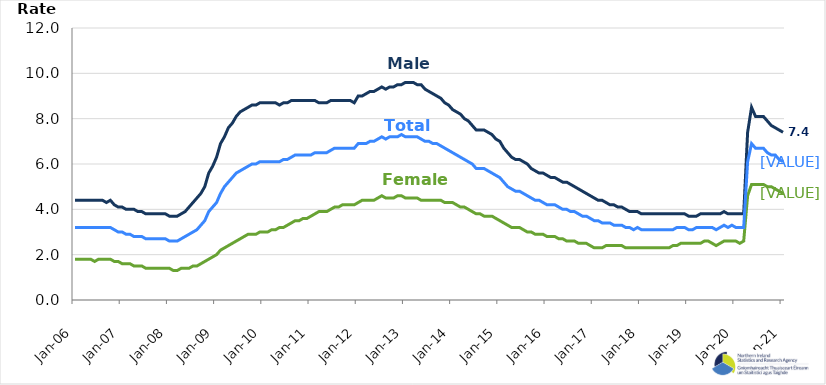
| Category | Male | Female | Total |
|---|---|---|---|
| 2006-01-01 | 4.4 | 1.8 | 3.2 |
| 2006-02-01 | 4.4 | 1.8 | 3.2 |
| 2006-03-01 | 4.4 | 1.8 | 3.2 |
| 2006-04-01 | 4.4 | 1.8 | 3.2 |
| 2006-05-01 | 4.4 | 1.8 | 3.2 |
| 2006-06-01 | 4.4 | 1.7 | 3.2 |
| 2006-07-01 | 4.4 | 1.8 | 3.2 |
| 2006-08-01 | 4.4 | 1.8 | 3.2 |
| 2006-09-01 | 4.3 | 1.8 | 3.2 |
| 2006-10-01 | 4.4 | 1.8 | 3.2 |
| 2006-11-01 | 4.2 | 1.7 | 3.1 |
| 2006-12-01 | 4.1 | 1.7 | 3 |
| 2007-01-01 | 4.1 | 1.6 | 3 |
| 2007-02-01 | 4 | 1.6 | 2.9 |
| 2007-03-01 | 4 | 1.6 | 2.9 |
| 2007-04-01 | 4 | 1.5 | 2.8 |
| 2007-05-01 | 3.9 | 1.5 | 2.8 |
| 2007-06-01 | 3.9 | 1.5 | 2.8 |
| 2007-07-01 | 3.8 | 1.4 | 2.7 |
| 2007-08-01 | 3.8 | 1.4 | 2.7 |
| 2007-09-01 | 3.8 | 1.4 | 2.7 |
| 2007-10-01 | 3.8 | 1.4 | 2.7 |
| 2007-11-01 | 3.8 | 1.4 | 2.7 |
| 2007-12-01 | 3.8 | 1.4 | 2.7 |
| 2008-01-01 | 3.7 | 1.4 | 2.6 |
| 2008-02-01 | 3.7 | 1.3 | 2.6 |
| 2008-03-01 | 3.7 | 1.3 | 2.6 |
| 2008-04-01 | 3.8 | 1.4 | 2.7 |
| 2008-05-01 | 3.9 | 1.4 | 2.8 |
| 2008-06-01 | 4.1 | 1.4 | 2.9 |
| 2008-07-01 | 4.3 | 1.5 | 3 |
| 2008-08-01 | 4.5 | 1.5 | 3.1 |
| 2008-09-01 | 4.7 | 1.6 | 3.3 |
| 2008-10-01 | 5 | 1.7 | 3.5 |
| 2008-11-01 | 5.6 | 1.8 | 3.9 |
| 2008-12-01 | 5.9 | 1.9 | 4.1 |
| 2009-01-01 | 6.3 | 2 | 4.3 |
| 2009-02-01 | 6.9 | 2.2 | 4.7 |
| 2009-03-01 | 7.2 | 2.3 | 5 |
| 2009-04-01 | 7.6 | 2.4 | 5.2 |
| 2009-05-01 | 7.8 | 2.5 | 5.4 |
| 2009-06-01 | 8.1 | 2.6 | 5.6 |
| 2009-07-01 | 8.3 | 2.7 | 5.7 |
| 2009-08-01 | 8.4 | 2.8 | 5.8 |
| 2009-09-01 | 8.5 | 2.9 | 5.9 |
| 2009-10-01 | 8.6 | 2.9 | 6 |
| 2009-11-01 | 8.6 | 2.9 | 6 |
| 2009-12-01 | 8.7 | 3 | 6.1 |
| 2010-01-01 | 8.7 | 3 | 6.1 |
| 2010-02-01 | 8.7 | 3 | 6.1 |
| 2010-03-01 | 8.7 | 3.1 | 6.1 |
| 2010-04-01 | 8.7 | 3.1 | 6.1 |
| 2010-05-01 | 8.6 | 3.2 | 6.1 |
| 2010-06-01 | 8.7 | 3.2 | 6.2 |
| 2010-07-01 | 8.7 | 3.3 | 6.2 |
| 2010-08-01 | 8.8 | 3.4 | 6.3 |
| 2010-09-01 | 8.8 | 3.5 | 6.4 |
| 2010-10-01 | 8.8 | 3.5 | 6.4 |
| 2010-11-01 | 8.8 | 3.6 | 6.4 |
| 2010-12-01 | 8.8 | 3.6 | 6.4 |
| 2011-01-01 | 8.8 | 3.7 | 6.4 |
| 2011-02-01 | 8.8 | 3.8 | 6.5 |
| 2011-03-01 | 8.7 | 3.9 | 6.5 |
| 2011-04-01 | 8.7 | 3.9 | 6.5 |
| 2011-05-01 | 8.7 | 3.9 | 6.5 |
| 2011-06-01 | 8.8 | 4 | 6.6 |
| 2011-07-01 | 8.8 | 4.1 | 6.7 |
| 2011-08-01 | 8.8 | 4.1 | 6.7 |
| 2011-09-01 | 8.8 | 4.2 | 6.7 |
| 2011-10-01 | 8.8 | 4.2 | 6.7 |
| 2011-11-01 | 8.8 | 4.2 | 6.7 |
| 2011-12-01 | 8.7 | 4.2 | 6.7 |
| 2012-01-01 | 9 | 4.3 | 6.9 |
| 2012-02-01 | 9 | 4.4 | 6.9 |
| 2012-03-01 | 9.1 | 4.4 | 6.9 |
| 2012-04-01 | 9.2 | 4.4 | 7 |
| 2012-05-01 | 9.2 | 4.4 | 7 |
| 2012-06-01 | 9.3 | 4.5 | 7.1 |
| 2012-07-01 | 9.4 | 4.6 | 7.2 |
| 2012-08-01 | 9.3 | 4.5 | 7.1 |
| 2012-09-01 | 9.4 | 4.5 | 7.2 |
| 2012-10-01 | 9.4 | 4.5 | 7.2 |
| 2012-11-01 | 9.5 | 4.6 | 7.2 |
| 2012-12-01 | 9.5 | 4.6 | 7.3 |
| 2013-01-01 | 9.6 | 4.5 | 7.2 |
| 2013-02-01 | 9.6 | 4.5 | 7.2 |
| 2013-03-01 | 9.6 | 4.5 | 7.2 |
| 2013-04-01 | 9.5 | 4.5 | 7.2 |
| 2013-05-01 | 9.5 | 4.4 | 7.1 |
| 2013-06-01 | 9.3 | 4.4 | 7 |
| 2013-07-01 | 9.2 | 4.4 | 7 |
| 2013-08-01 | 9.1 | 4.4 | 6.9 |
| 2013-09-01 | 9 | 4.4 | 6.9 |
| 2013-10-01 | 8.9 | 4.4 | 6.8 |
| 2013-11-01 | 8.7 | 4.3 | 6.7 |
| 2013-12-01 | 8.6 | 4.3 | 6.6 |
| 2014-01-01 | 8.4 | 4.3 | 6.5 |
| 2014-02-01 | 8.3 | 4.2 | 6.4 |
| 2014-03-01 | 8.2 | 4.1 | 6.3 |
| 2014-04-01 | 8 | 4.1 | 6.2 |
| 2014-05-01 | 7.9 | 4 | 6.1 |
| 2014-06-01 | 7.7 | 3.9 | 6 |
| 2014-07-01 | 7.5 | 3.8 | 5.8 |
| 2014-08-01 | 7.5 | 3.8 | 5.8 |
| 2014-09-01 | 7.5 | 3.7 | 5.8 |
| 2014-10-01 | 7.4 | 3.7 | 5.7 |
| 2014-11-01 | 7.3 | 3.7 | 5.6 |
| 2014-12-01 | 7.1 | 3.6 | 5.5 |
| 2015-01-01 | 7 | 3.5 | 5.4 |
| 2015-02-01 | 6.7 | 3.4 | 5.2 |
| 2015-03-01 | 6.5 | 3.3 | 5 |
| 2015-04-01 | 6.3 | 3.2 | 4.9 |
| 2015-05-01 | 6.2 | 3.2 | 4.8 |
| 2015-06-01 | 6.2 | 3.2 | 4.8 |
| 2015-07-01 | 6.1 | 3.1 | 4.7 |
| 2015-08-01 | 6 | 3 | 4.6 |
| 2015-09-01 | 5.8 | 3 | 4.5 |
| 2015-10-01 | 5.7 | 2.9 | 4.4 |
| 2015-11-01 | 5.6 | 2.9 | 4.4 |
| 2015-12-01 | 5.6 | 2.9 | 4.3 |
| 2016-01-01 | 5.5 | 2.8 | 4.2 |
| 2016-02-01 | 5.4 | 2.8 | 4.2 |
| 2016-03-01 | 5.4 | 2.8 | 4.2 |
| 2016-04-01 | 5.3 | 2.7 | 4.1 |
| 2016-05-01 | 5.2 | 2.7 | 4 |
| 2016-06-01 | 5.2 | 2.6 | 4 |
| 2016-07-01 | 5.1 | 2.6 | 3.9 |
| 2016-08-01 | 5 | 2.6 | 3.9 |
| 2016-09-01 | 4.9 | 2.5 | 3.8 |
| 2016-10-01 | 4.8 | 2.5 | 3.7 |
| 2016-11-01 | 4.7 | 2.5 | 3.7 |
| 2016-12-01 | 4.6 | 2.4 | 3.6 |
| 2017-01-01 | 4.5 | 2.3 | 3.5 |
| 2017-02-01 | 4.4 | 2.3 | 3.5 |
| 2017-03-01 | 4.4 | 2.3 | 3.4 |
| 2017-04-01 | 4.3 | 2.4 | 3.4 |
| 2017-05-01 | 4.2 | 2.4 | 3.4 |
| 2017-06-01 | 4.2 | 2.4 | 3.3 |
| 2017-07-01 | 4.1 | 2.4 | 3.3 |
| 2017-08-01 | 4.1 | 2.4 | 3.3 |
| 2017-09-01 | 4 | 2.3 | 3.2 |
| 2017-10-01 | 3.9 | 2.3 | 3.2 |
| 2017-11-01 | 3.9 | 2.3 | 3.1 |
| 2017-12-01 | 3.9 | 2.3 | 3.2 |
| 2018-01-01 | 3.8 | 2.3 | 3.1 |
| 2018-02-01 | 3.8 | 2.3 | 3.1 |
| 2018-03-01 | 3.8 | 2.3 | 3.1 |
| 2018-04-01 | 3.8 | 2.3 | 3.1 |
| 2018-05-01 | 3.8 | 2.3 | 3.1 |
| 2018-06-01 | 3.8 | 2.3 | 3.1 |
| 2018-07-01 | 3.8 | 2.3 | 3.1 |
| 2018-08-01 | 3.8 | 2.3 | 3.1 |
| 2018-09-01 | 3.8 | 2.4 | 3.1 |
| 2018-10-01 | 3.8 | 2.4 | 3.2 |
| 2018-11-01 | 3.8 | 2.5 | 3.2 |
| 2018-12-01 | 3.8 | 2.5 | 3.2 |
| 2019-01-01 | 3.7 | 2.5 | 3.1 |
| 2019-02-01 | 3.7 | 2.5 | 3.1 |
| 2019-03-01 | 3.7 | 2.5 | 3.2 |
| 2019-04-01 | 3.8 | 2.5 | 3.2 |
| 2019-05-01 | 3.8 | 2.6 | 3.2 |
| 2019-06-01 | 3.8 | 2.6 | 3.2 |
| 2019-07-01 | 3.8 | 2.5 | 3.2 |
| 2019-08-01 | 3.8 | 2.4 | 3.1 |
| 2019-09-01 | 3.8 | 2.5 | 3.2 |
| 2019-10-01 | 3.9 | 2.6 | 3.3 |
| 2019-11-01 | 3.8 | 2.6 | 3.2 |
| 2019-12-01 | 3.8 | 2.6 | 3.3 |
| 2020-01-01 | 3.8 | 2.6 | 3.2 |
| 2020-02-01 | 3.8 | 2.5 | 3.2 |
| 2020-03-01 | 3.8 | 2.6 | 3.2 |
| 2020-04-01 | 7.4 | 4.6 | 6.1 |
| 2020-05-01 | 8.5 | 5.1 | 6.9 |
| 2020-06-01 | 8.1 | 5.1 | 6.7 |
| 2020-07-01 | 8.1 | 5.1 | 6.7 |
| 2020-08-01 | 8.1 | 5.1 | 6.7 |
| 2020-09-01 | 7.9 | 5 | 6.5 |
| 2020-10-01 | 7.7 | 5 | 6.4 |
| 2020-11-01 | 7.6 | 4.9 | 6.4 |
| 2020-12-01 | 7.5 | 4.8 | 6.2 |
| 2021-01-01 | 7.4 | 4.7 | 6.1 |